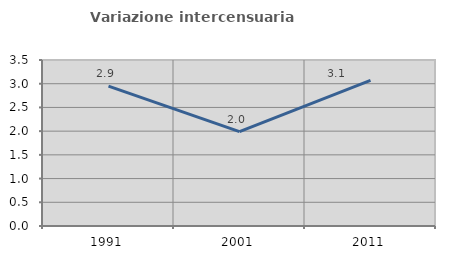
| Category | Variazione intercensuaria annua |
|---|---|
| 1991.0 | 2.949 |
| 2001.0 | 1.989 |
| 2011.0 | 3.071 |